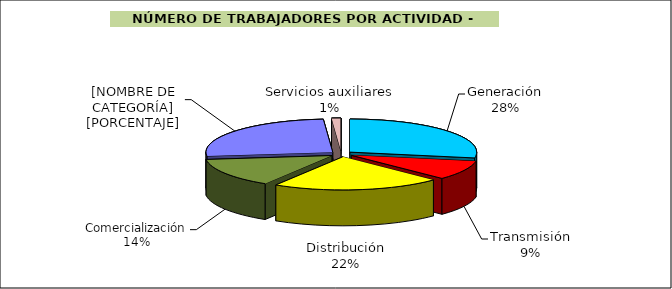
| Category | Series 0 |
|---|---|
| Generación | 27.817 |
| Transmisión | 9.491 |
| Distribución | 21.537 |
| Comercialización | 14.259 |
| Administración | 25.712 |
| Servicios auxiliares | 1.184 |